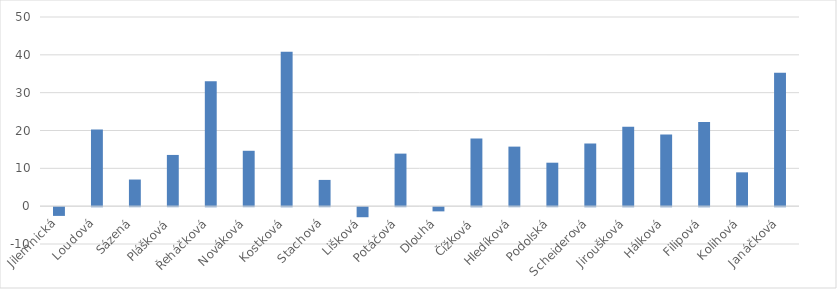
| Category | Series 0 |
|---|---|
| Jilemnická | -2.31 |
| Loudová | 20.24 |
| Sázená | 7.04 |
| Plášková | 13.54 |
| Řeháčková | 32.99 |
| Nováková | 14.64 |
| Kostková | 40.84 |
| Stachová | 6.94 |
| Lišková | -2.66 |
| Potáčová | 13.89 |
| Dlouhá | -1.11 |
| Čížková | 17.89 |
| Hledíková | 15.74 |
| Podolská | 11.49 |
| Scheiderová | 16.59 |
| Jiroušková | 20.99 |
| Hálková | 18.94 |
| Filipová | 22.24 |
| Kolihová | 8.94 |
| Janáčková | 35.29 |